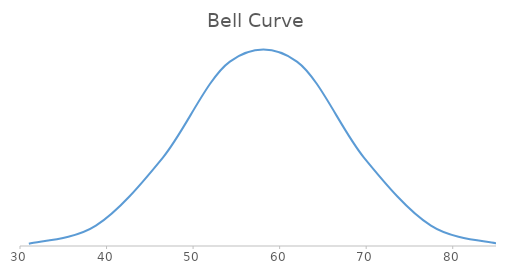
| Category | Series 0 |
|---|---|
| 31.02362780226802 | 0 |
| 38.76687700162002 | 0.004 |
| 46.51012620097201 | 0.019 |
| 54.253375400324 | 0.04 |
| 61.996624599676 | 0.04 |
| 69.73987379902799 | 0.019 |
| 77.48312299837998 | 0.004 |
| 85.22637219773198 | 0 |